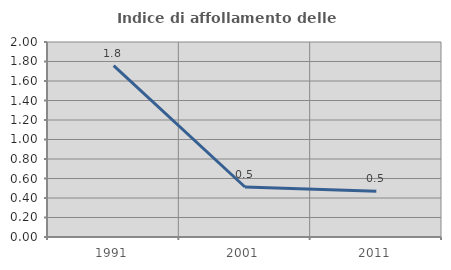
| Category | Indice di affollamento delle abitazioni  |
|---|---|
| 1991.0 | 1.758 |
| 2001.0 | 0.513 |
| 2011.0 | 0.469 |